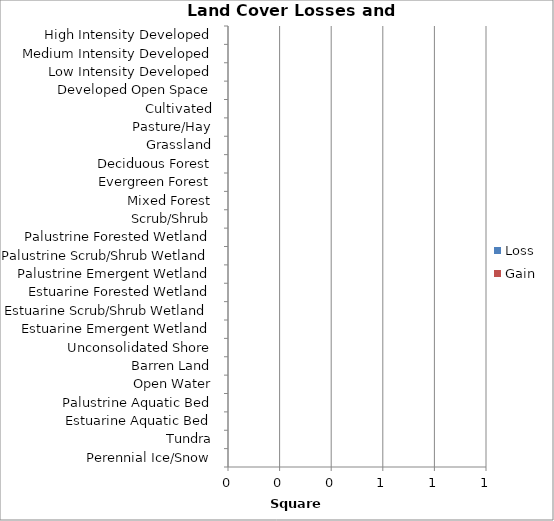
| Category | Loss | Gain |
|---|---|---|
| High Intensity Developed | 0 | 0 |
| Medium Intensity Developed | 0 | 0 |
| Low Intensity Developed | 0 | 0 |
| Developed Open Space | 0 | 0 |
| Cultivated | 0 | 0 |
| Pasture/Hay | 0 | 0 |
| Grassland | 0 | 0 |
| Deciduous Forest | 0 | 0 |
| Evergreen Forest | 0 | 0 |
| Mixed Forest | 0 | 0 |
| Scrub/Shrub | 0 | 0 |
| Palustrine Forested Wetland | 0 | 0 |
| Palustrine Scrub/Shrub Wetland | 0 | 0 |
| Palustrine Emergent Wetland | 0 | 0 |
| Estuarine Forested Wetland | 0 | 0 |
| Estuarine Scrub/Shrub Wetland | 0 | 0 |
| Estuarine Emergent Wetland | 0 | 0 |
| Unconsolidated Shore | 0 | 0 |
| Barren Land | 0 | 0 |
| Open Water | 0 | 0 |
| Palustrine Aquatic Bed | 0 | 0 |
| Estuarine Aquatic Bed | 0 | 0 |
| Tundra | 0 | 0 |
| Perennial Ice/Snow | 0 | 0 |